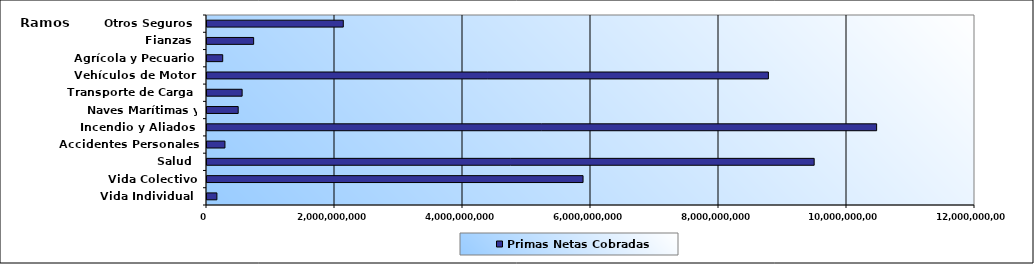
| Category | Primas Netas Cobradas |
|---|---|
| Vida Individual  | 154603729.25 |
| Vida Colectivo | 5875829635.81 |
| Salud  | 9487202418.68 |
| Accidentes Personales | 280373199.41 |
| Incendio y Aliados  | 10463025667.24 |
| Naves Marítimas y Aéreas  | 487461881.15 |
| Transporte de Carga  | 548910574.45 |
| Vehículos de Motor  | 8771799707.34 |
| Agrícola y Pecuario  | 245393199.75 |
| Fianzas  | 728935234.89 |
| Otros Seguros  | 2129668356.54 |